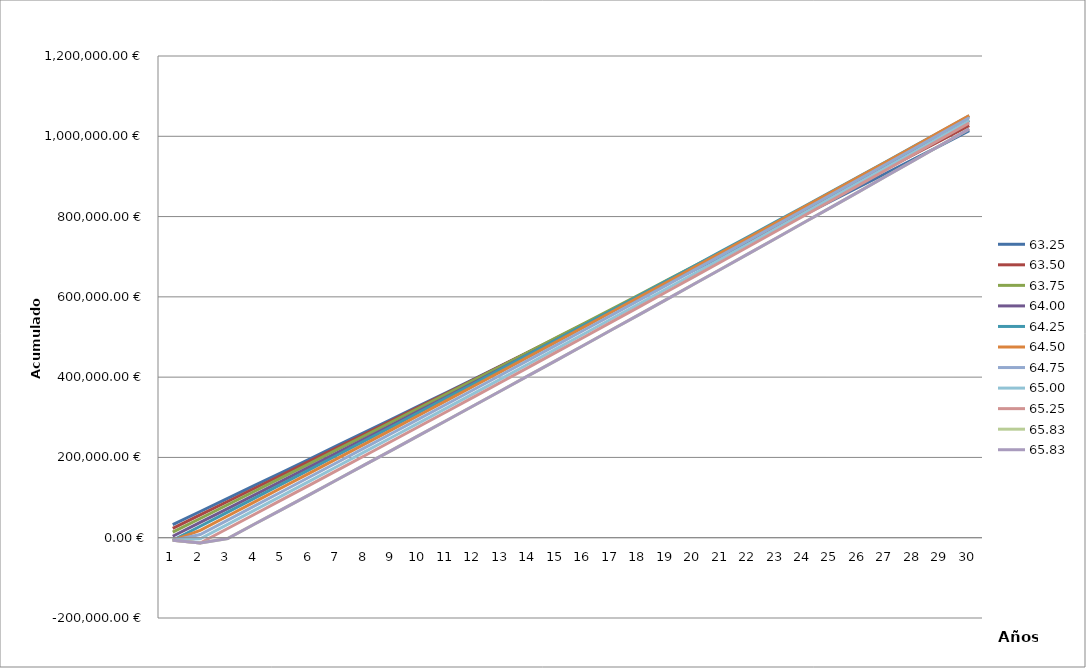
| Category | 63,25 | 63,50 | 63,75 | 64,00 | 64,25 | 64,50 | 64,75 | 65,00 | 65,25 | 65,83 |
|---|---|---|---|---|---|---|---|---|---|---|
| 0 | 32585 | 23340 | 13727.5 | 3647.381 | -6600 | -6600 | -6600 | -6600 | -6600 | -6600 |
| 1 | 65251.462 | 56743.3 | 47867.638 | 38122.881 | 28603.855 | 18428.37 | 7970.837 | -2600.483 | -13216.5 | -13216.5 |
| 2 | 97999.591 | 90230.108 | 82093.125 | 72684.57 | 63895.72 | 54093.972 | 43818.406 | 33336.706 | 22903.111 | -1882.481 |
| 3 | 130829.59 | 123800.634 | 116404.177 | 107332.663 | 99275.815 | 89848.738 | 79755.595 | 69363.737 | 59113.02 | 34693.186 |
| 4 | 163741.664 | 157455.085 | 150801.006 | 142067.376 | 134744.36 | 125692.891 | 115782.626 | 105480.836 | 95413.455 | 71360.291 |
| 5 | 196736.018 | 191193.673 | 185283.827 | 176888.925 | 170301.577 | 161626.655 | 151899.725 | 141688.227 | 131804.64 | 108119.064 |
| 6 | 229812.858 | 225016.607 | 219852.856 | 211797.529 | 205947.686 | 197650.252 | 188107.116 | 177986.137 | 168286.803 | 144969.734 |
| 7 | 262972.39 | 258924.099 | 254508.307 | 246793.404 | 241682.911 | 233763.909 | 224405.026 | 214374.792 | 204860.172 | 181912.531 |
| 8 | 296214.821 | 292916.359 | 289250.396 | 281876.769 | 277507.473 | 269967.85 | 260793.681 | 250854.419 | 241524.975 | 218947.685 |
| 9 | 329540.358 | 326993.6 | 324079.341 | 317047.842 | 313421.597 | 306262.301 | 297273.308 | 287425.244 | 278281.439 | 256075.427 |
| 10 | 362949.209 | 361156.034 | 358995.358 | 352306.843 | 349425.507 | 342647.487 | 333844.133 | 324087.497 | 315129.794 | 293295.988 |
| 11 | 396441.582 | 395403.874 | 393998.665 | 387653.992 | 385519.426 | 379123.637 | 370506.386 | 360841.405 | 352070.271 | 330609.6 |
| 12 | 430017.686 | 429737.333 | 429089.48 | 423089.508 | 421703.58 | 415690.977 | 407260.294 | 397687.198 | 389103.098 | 368016.497 |
| 13 | 463677.731 | 464156.627 | 464268.023 | 458613.613 | 457978.194 | 452349.736 | 444106.087 | 434625.106 | 426228.508 | 405516.91 |
| 14 | 497421.925 | 498661.968 | 499534.512 | 494226.529 | 494343.495 | 489100.141 | 481043.995 | 471655.358 | 463446.731 | 443111.075 |
| 15 | 531250.48 | 533253.573 | 534889.167 | 529928.476 | 530799.709 | 525942.423 | 518074.247 | 508778.186 | 500757.999 | 480799.225 |
| 16 | 565163.606 | 567931.657 | 570332.208 | 565719.679 | 567347.064 | 562876.81 | 555197.075 | 545993.821 | 538162.546 | 518581.596 |
| 17 | 599161.515 | 602696.436 | 605863.858 | 601600.359 | 603985.787 | 599903.533 | 592412.71 | 583302.495 | 575660.604 | 556458.422 |
| 18 | 633244.419 | 637548.127 | 641484.336 | 637570.742 | 640716.107 | 637022.823 | 629721.384 | 620704.441 | 613252.408 | 594429.941 |
| 19 | 667412.53 | 672486.948 | 677193.866 | 673631.05 | 677538.253 | 674234.911 | 667123.33 | 658199.891 | 650938.191 | 632496.388 |
| 20 | 701666.061 | 707513.115 | 712992.669 | 709781.509 | 714452.454 | 711540.03 | 704618.78 | 695789.08 | 688718.188 | 670658.002 |
| 21 | 736005.226 | 742626.848 | 748880.97 | 746022.344 | 751458.94 | 748938.411 | 742207.969 | 733472.243 | 726592.635 | 708915.019 |
| 22 | 770430.239 | 777828.365 | 784858.991 | 782353.781 | 788557.943 | 786430.288 | 779891.132 | 771249.613 | 764561.769 | 747267.679 |
| 23 | 804941.315 | 813117.886 | 820926.957 | 818776.047 | 825749.694 | 824015.895 | 817668.502 | 809121.426 | 802625.825 | 785716.221 |
| 24 | 839538.668 | 848495.631 | 857085.093 | 855289.368 | 863034.423 | 861695.465 | 855540.315 | 847087.919 | 840785.041 | 824260.884 |
| 25 | 874222.515 | 883961.82 | 893333.625 | 891893.973 | 900412.365 | 899469.235 | 893506.808 | 885149.329 | 879039.656 | 862901.908 |
| 26 | 908993.071 | 919516.674 | 929672.777 | 928590.089 | 937883.751 | 937337.439 | 931568.218 | 923305.892 | 917389.907 | 901639.536 |
| 27 | 943850.554 | 955160.416 | 966102.778 | 965377.946 | 975448.816 | 975300.314 | 969724.781 | 961557.846 | 955836.033 | 940474.007 |
| 28 | 978795.18 | 990893.267 | 1002623.854 | 1002257.772 | 1013107.793 | 1013358.096 | 1007976.735 | 999905.43 | 994378.275 | 979405.564 |
| 29 | 1013827.168 | 1026715.45 | 1039236.232 | 1039229.798 | 1050860.918 | 1051511.022 | 1046324.319 | 1038348.883 | 1033016.873 | 1018434.451 |